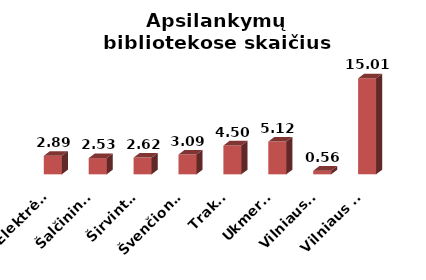
| Category | Series 0 |
|---|---|
|  Elektrėnai | 2.892 |
|  Šalčininkai | 2.529 |
|  Širvintos | 2.616 |
|  Švenčionys | 3.092 |
|  Trakai | 4.502 |
|  Ukmergė | 5.118 |
|  Vilniaus r. | 0.563 |
|  Vilniaus m. | 15.006 |